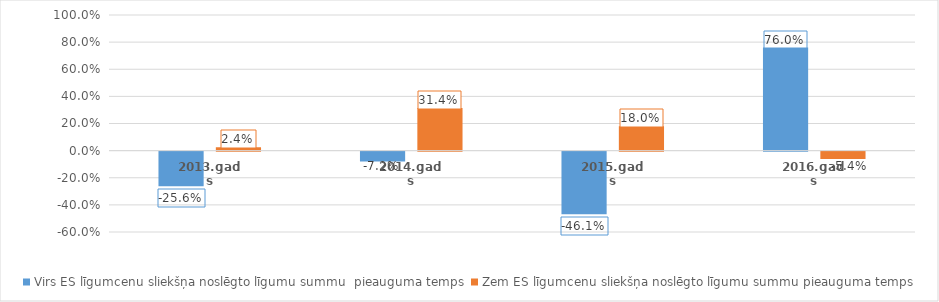
| Category | Virs ES līgumcenu sliekšņa noslēgto līgumu summu  pieauguma temps | Zem ES līgumcenu sliekšņa noslēgto līgumu summu pieauguma temps |
|---|---|---|
| 2013.gads | -0.256 | 0.024 |
| 2014.gads | -0.072 | 0.314 |
| 2015.gads | -0.461 | 0.18 |
| 2016.gads | 0.76 | -0.054 |